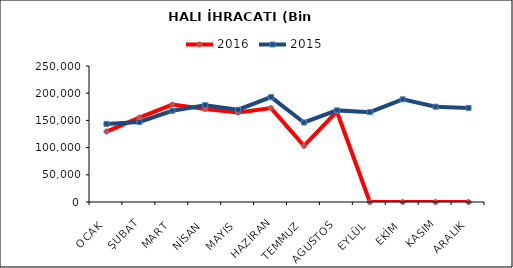
| Category | 2016 | 2015 |
|---|---|---|
| OCAK | 129495.756 | 143592.341 |
| ŞUBAT | 155035.064 | 147034.173 |
| MART | 179018.747 | 167697.597 |
| NİSAN | 170947.788 | 177976.829 |
| MAYIS | 164570.644 | 169615.877 |
| HAZİRAN | 172583.808 | 192780.133 |
| TEMMUZ | 103306.043 | 146176.549 |
| AGUSTOS | 166411.598 | 168405.251 |
| EYLÜL | 0 | 165188.115 |
| EKİM | 0 | 188749.88 |
| KASIM | 0 | 175218.905 |
| ARALIK | 0 | 172919.191 |